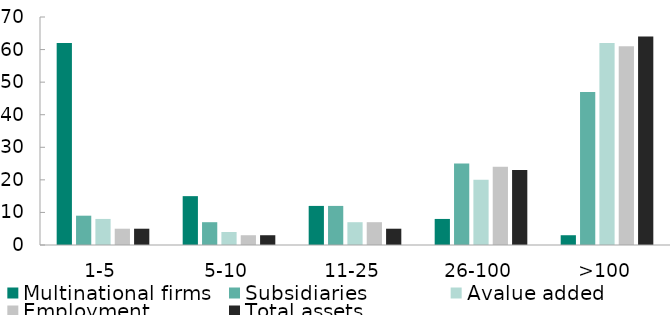
| Category | Multinational firms | Subsidiaries | Avalue added | Employment | Total assets |
|---|---|---|---|---|---|
| 1-5 | 62 | 9 | 8 | 5 | 5 |
| 5-10 | 15 | 7 | 4 | 3 | 3 |
| 11-25 | 12 | 12 | 7 | 7 | 5 |
| 26-100 | 8 | 25 | 20 | 24 | 23 |
| >100 | 3 | 47 | 62 | 61 | 64 |